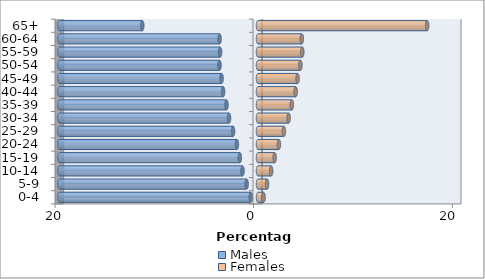
| Category | Males | Females |
|---|---|---|
| 0-4 | -0.731 | 0.554 |
| 5-9 | -1.146 | 0.916 |
| 10-14 | -1.56 | 1.326 |
| 15-19 | -1.829 | 1.677 |
| 20-24 | -2.125 | 2.103 |
| 25-29 | -2.507 | 2.607 |
| 30-34 | -2.916 | 3.087 |
| 35-39 | -3.178 | 3.405 |
| 40-44 | -3.511 | 3.791 |
| 45-49 | -3.667 | 3.985 |
| 50-54 | -3.876 | 4.271 |
| 55-59 | -3.817 | 4.459 |
| 60-64 | -3.867 | 4.41 |
| 65+ | -11.648 | 17.031 |